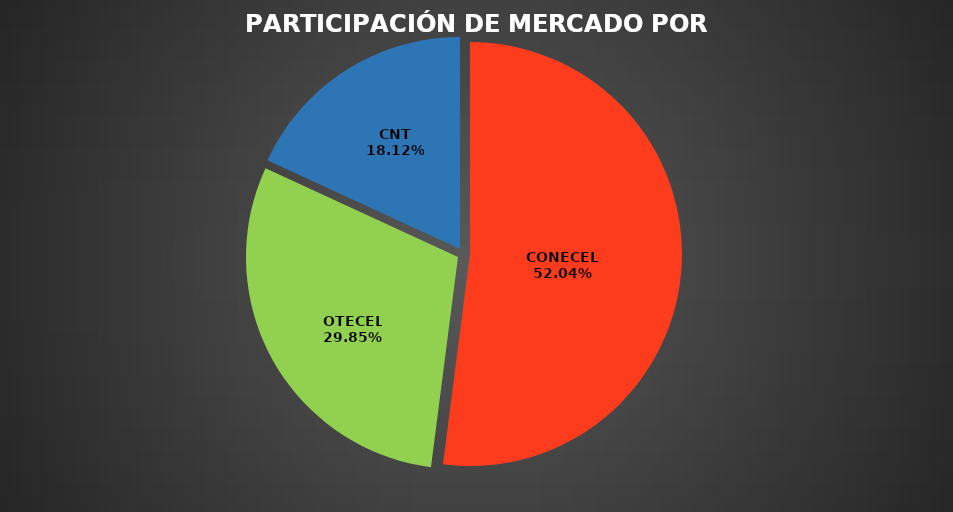
| Category | Ene2024 |
|---|---|
| CONECEL | 9444024 |
| OTECEL | 5416623 |
| CNT | 3288468 |